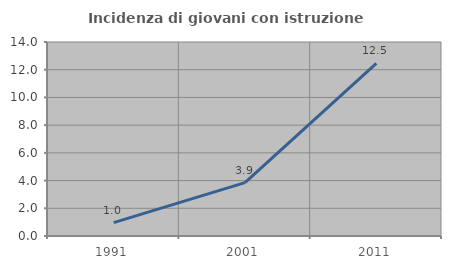
| Category | Incidenza di giovani con istruzione universitaria |
|---|---|
| 1991.0 | 0.966 |
| 2001.0 | 3.854 |
| 2011.0 | 12.462 |